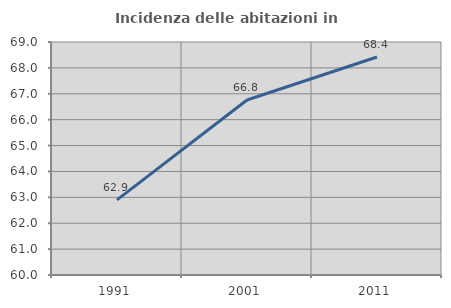
| Category | Incidenza delle abitazioni in proprietà  |
|---|---|
| 1991.0 | 62.9 |
| 2001.0 | 66.76 |
| 2011.0 | 68.421 |